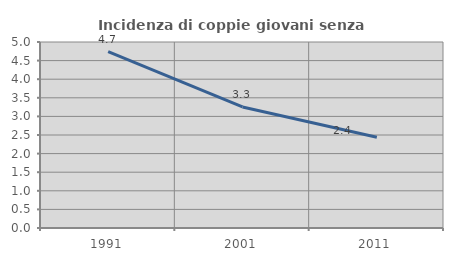
| Category | Incidenza di coppie giovani senza figli |
|---|---|
| 1991.0 | 4.741 |
| 2001.0 | 3.255 |
| 2011.0 | 2.438 |